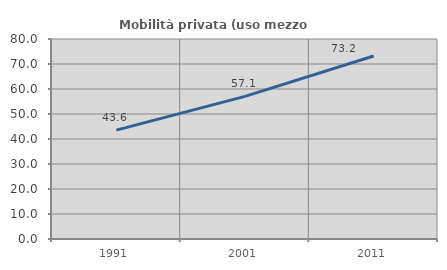
| Category | Mobilità privata (uso mezzo privato) |
|---|---|
| 1991.0 | 43.564 |
| 2001.0 | 57.053 |
| 2011.0 | 73.203 |